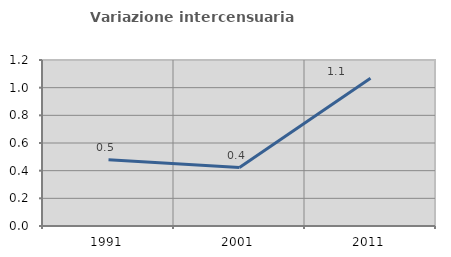
| Category | Variazione intercensuaria annua |
|---|---|
| 1991.0 | 0.478 |
| 2001.0 | 0.422 |
| 2011.0 | 1.068 |